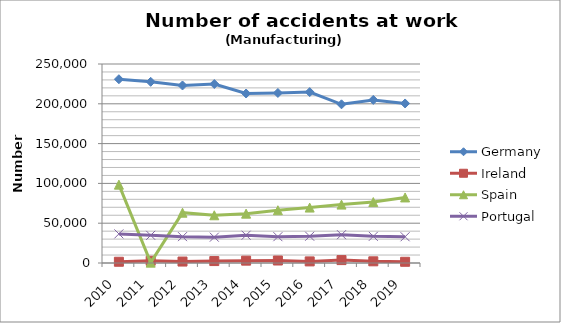
| Category | Germany | Ireland | Spain | Portugal |
|---|---|---|---|---|
| 2010 | 230878 | 1564 | 98437 | 36555 |
| 2011 | 227611 | 2823 | 454 | 34775 |
| 2012 | 223015 | 1824 | 63212 | 33115 |
| 2013 | 224852 | 2416 | 59950 | 32432 |
| 2014 | 212934 | 2949 | 62005 | 34906 |
| 2015 | 213608 | 3133 | 66266 | 33062 |
| 2016 | 214713 | 2008 | 69642 | 33623 |
| 2017 | 199361 | 3641 | 73387 | 35549 |
| 2018 | 204894 | 2115 | 76558 | 33476 |
| 2019 | 200434 | 1526 | 82364 | 32968 |